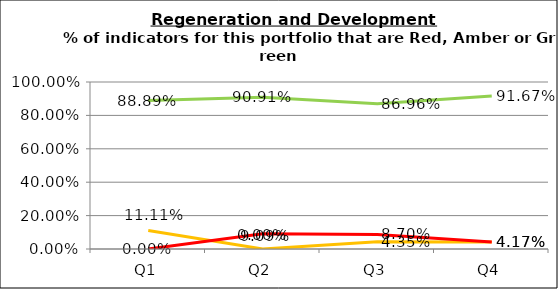
| Category | Green | Amber | Red |
|---|---|---|---|
| Q1 | 0.889 | 0.111 | 0 |
| Q2 | 0.909 | 0 | 0.091 |
| Q3 | 0.87 | 0.043 | 0.087 |
| Q4 | 0.917 | 0.042 | 0.042 |